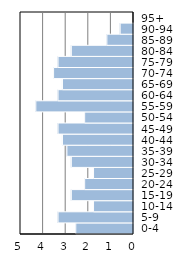
| Category | Series 0 |
|---|---|
| 0-4 | 2.554 |
| 5-9 | 3.34 |
| 10-14 | 1.768 |
| 15-19 | 2.75 |
| 20-24 | 2.161 |
| 25-29 | 1.768 |
| 30-34 | 2.75 |
| 35-39 | 2.947 |
| 40-44 | 3.143 |
| 45-49 | 3.34 |
| 50-54 | 2.161 |
| 55-59 | 4.322 |
| 60-64 | 3.34 |
| 65-69 | 3.143 |
| 70-74 | 3.536 |
| 75-79 | 3.34 |
| 80-84 | 2.75 |
| 85-89 | 1.179 |
| 90-94 | 0.589 |
| 95+ | 0 |